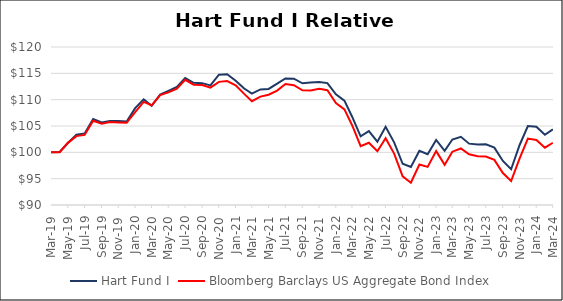
| Category | Hart Fund I | Bloomberg Barclays US Aggregate Bond Index |
|---|---|---|
| 2019-03-01 | 100 | 100 |
| 2019-04-01 | 100.074 | 100.026 |
| 2019-05-01 | 101.775 | 101.801 |
| 2019-06-01 | 103.353 | 103.08 |
| 2019-07-01 | 103.596 | 103.306 |
| 2019-08-01 | 106.315 | 105.983 |
| 2019-09-01 | 105.664 | 105.419 |
| 2019-10-01 | 105.934 | 105.737 |
| 2019-11-01 | 105.948 | 105.682 |
| 2019-12-01 | 105.836 | 105.609 |
| 2020-01-01 | 108.39 | 107.641 |
| 2020-02-01 | 110.06 | 109.579 |
| 2020-03-01 | 108.831 | 108.934 |
| 2020-04-01 | 110.956 | 110.87 |
| 2020-05-01 | 111.659 | 111.386 |
| 2020-06-01 | 112.412 | 112.088 |
| 2020-07-01 | 114.101 | 113.762 |
| 2020-08-01 | 113.193 | 112.844 |
| 2020-09-01 | 113.14 | 112.782 |
| 2020-10-01 | 112.718 | 112.279 |
| 2020-11-01 | 114.738 | 113.38 |
| 2020-12-01 | 114.841 | 113.536 |
| 2021-01-01 | 113.603 | 112.722 |
| 2021-02-01 | 112.109 | 111.095 |
| 2021-03-01 | 111.157 | 109.707 |
| 2021-04-01 | 111.949 | 110.574 |
| 2021-05-01 | 112.041 | 110.935 |
| 2021-06-01 | 113.029 | 111.715 |
| 2021-07-01 | 114.038 | 112.964 |
| 2021-08-01 | 113.994 | 112.749 |
| 2021-09-01 | 113.108 | 111.773 |
| 2021-10-01 | 113.255 | 111.742 |
| 2021-11-01 | 113.349 | 112.073 |
| 2021-12-01 | 113.151 | 111.786 |
| 2022-01-01 | 111.022 | 109.378 |
| 2022-02-01 | 109.811 | 108.157 |
| 2022-03-01 | 106.766 | 105.152 |
| 2022-04-01 | 103.035 | 101.162 |
| 2022-05-01 | 104.025 | 101.814 |
| 2022-06-01 | 102.018 | 100.217 |
| 2022-07-01 | 104.843 | 102.666 |
| 2022-08-01 | 101.899 | 99.765 |
| 2022-09-01 | 97.832 | 95.454 |
| 2022-10-01 | 97.207 | 94.218 |
| 2022-11-01 | 100.283 | 97.683 |
| 2022-12-01 | 99.638 | 97.242 |
| 2023-01-01 | 102.36 | 100.234 |
| 2023-02-01 | 100.295 | 97.642 |
| 2023-03-01 | 102.441 | 100.122 |
| 2023-04-01 | 102.954 | 100.73 |
| 2023-05-01 | 101.648 | 99.633 |
| 2023-06-01 | 101.501 | 99.277 |
| 2023-07-01 | 101.516 | 99.208 |
| 2023-08-01 | 100.895 | 98.575 |
| 2023-09-01 | 98.361 | 96.069 |
| 2023-10-01 | 96.791 | 94.553 |
| 2023-11-01 | 101.395 | 98.835 |
| 2023-12-01 | 104.985 | 102.619 |
| 2024-01-01 | 104.87 | 102.337 |
| 2024-02-01 | 103.333 | 100.891 |
| 2024-03-01 | 104.374 | 101.823 |